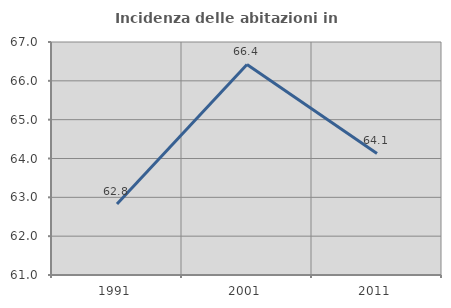
| Category | Incidenza delle abitazioni in proprietà  |
|---|---|
| 1991.0 | 62.829 |
| 2001.0 | 66.421 |
| 2011.0 | 64.129 |